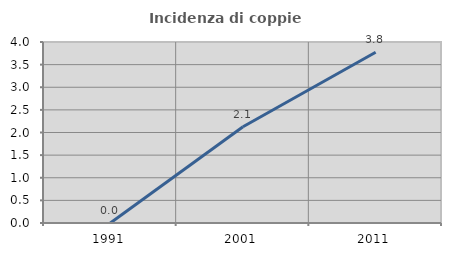
| Category | Incidenza di coppie miste |
|---|---|
| 1991.0 | 0 |
| 2001.0 | 2.128 |
| 2011.0 | 3.774 |